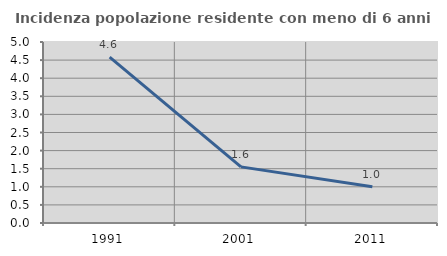
| Category | Incidenza popolazione residente con meno di 6 anni |
|---|---|
| 1991.0 | 4.582 |
| 2001.0 | 1.55 |
| 2011.0 | 1 |